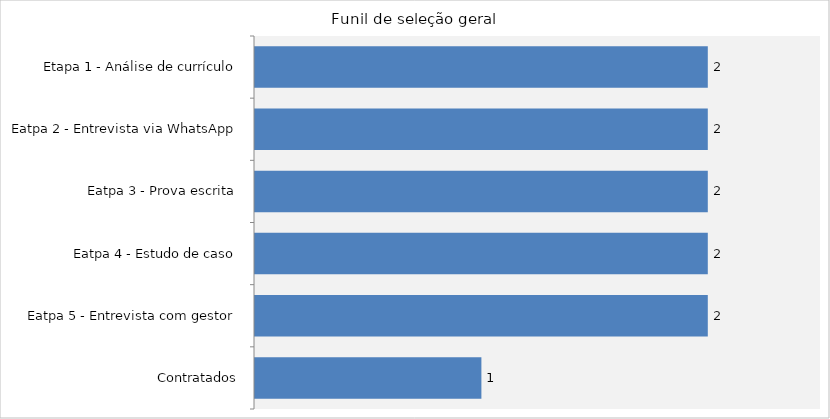
| Category | Número de Candidatos |
|---|---|
| Etapa 1 - Análise de currículo | 2 |
| Eatpa 2 - Entrevista via WhatsApp | 2 |
| Eatpa 3 - Prova escrita | 2 |
| Eatpa 4 - Estudo de caso | 2 |
| Eatpa 5 - Entrevista com gestor | 2 |
| Contratados | 1 |